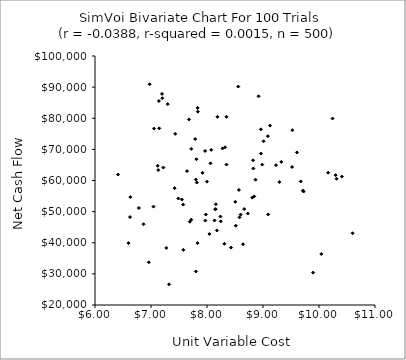
| Category | Series 0 |
|---|---|
| 8.5799233662857 | 48154.977 |
| 8.322798937939595 | 70682.516 |
| 7.201467640726995 | 86436.542 |
| 7.811482448741565 | 66834.482 |
| 9.126457782483506 | 77634.784 |
| 6.412461766414863 | 61919.692 |
| 7.719423426696527 | 70156.49 |
| 8.558672436460132 | 90184.727 |
| 7.718661596310512 | 47412.031 |
| 8.134011712817045 | 47153.823 |
| 8.277950662160677 | 70315.161 |
| 8.842556173277387 | 54893.189 |
| 7.817644752392725 | 59352.218 |
| 8.176340179564193 | 43958.341 |
| 7.4217532251195735 | 57531.764 |
| 6.960760332587584 | 33721.525 |
| 7.8313111702073375 | 39877.598 |
| 9.71253204860519 | 56752.994 |
| 9.009559051875458 | 72608.133 |
| 8.429496647251241 | 38446.169 |
| 7.8008792750240925 | 60314.183 |
| 8.07472128533649 | 69834.565 |
| 9.518861166413696 | 64337.299 |
| 7.970406837737856 | 47130.569 |
| 7.273194652571533 | 38325.851 |
| 7.489083048809267 | 54219.643 |
| 6.625377284255234 | 48262.903 |
| 7.128963195392983 | 63352.325 |
| 8.865515044995588 | 60252.798 |
| 9.52524895477391 | 76166.652 |
| 7.147236327511475 | 76750.597 |
| 9.605819153306468 | 69012.145 |
| 10.241340660086065 | 79919.617 |
| 10.162434953613667 | 62504.389 |
| 8.98643888838562 | 65119.808 |
| 10.407936328515019 | 61264.208 |
| 7.80082965003337 | 30782.138 |
| 6.784236433408008 | 51160.156 |
| 10.599768073922213 | 43050.604 |
| 8.643014296777642 | 39518.392 |
| 8.807678212906168 | 54506.837 |
| 8.600419279409046 | 49043.354 |
| 6.975359096767873 | 90921.868 |
| 9.086596772953316 | 74244.306 |
| 7.577680843721031 | 37711.497 |
| 7.551469433422725 | 53905.237 |
| 7.836890463266036 | 82120.994 |
| 9.326992812133225 | 65974.258 |
| 7.5745251901715385 | 52260.231 |
| 7.322483061726135 | 26633.522 |
| 8.822264579407284 | 66494.181 |
| 7.833156971276349 | 83312.582 |
| 9.674772377563313 | 59711.915 |
| 8.156055103904192 | 50778.428 |
| 8.157255140924462 | 52375.896 |
| 9.292115899744925 | 59511.311 |
| 9.894085944671128 | 30399.982 |
| 8.664326146974176 | 50832.575 |
| 8.570173434086822 | 56965.683 |
| 7.432071488580894 | 75000.899 |
| 10.04098471025165 | 36397.464 |
| 7.221376723690576 | 64164.308 |
| 8.505475958668336 | 53162.491 |
| 7.054271388777496 | 76683.565 |
| 8.347905742809601 | 80473.889 |
| 7.297879118243739 | 84532.355 |
| 8.245654359947244 | 46867.553 |
| 8.310356491929902 | 39668.014 |
| 7.965956030151336 | 69491.076 |
| 8.24025815329633 | 48421.043 |
| 7.999096391088855 | 59624.231 |
| 6.866053827382114 | 45949.343 |
| 8.042941091310917 | 42811.344 |
| 7.1412601472951 | 85524.032 |
| 9.724901645840218 | 56458.652 |
| 10.296987174791745 | 61718.995 |
| 8.51369282584637 | 45467.778 |
| 9.23186368257091 | 64909.654 |
| 7.9795982688006895 | 49068.584 |
| 7.642314292760345 | 63024.923 |
| 8.962169920184742 | 76433.511 |
| 7.0438523837948 | 51620.015 |
| 6.597758075026703 | 39893.698 |
| 7.920935150421331 | 62462.529 |
| 7.679708956540013 | 79619.578 |
| 7.196719318290606 | 87814.651 |
| 6.63118055024673 | 54668.487 |
| 8.348073995229859 | 65126.774 |
| 8.82716989691528 | 63850.068 |
| 7.69428427379326 | 46750.599 |
| 8.920333096546887 | 87060.518 |
| 8.18654853860172 | 80461.872 |
| 8.14617908735314 | 50763.754 |
| 9.092834100716615 | 49094.751 |
| 8.963035757919336 | 68637.506 |
| 7.118918414560007 | 64732.779 |
| 7.787961204840504 | 73323.767 |
| 8.729084537025106 | 49394.483 |
| 10.313668248811222 | 60547.096 |
| 8.062534990859206 | 65516.219 |